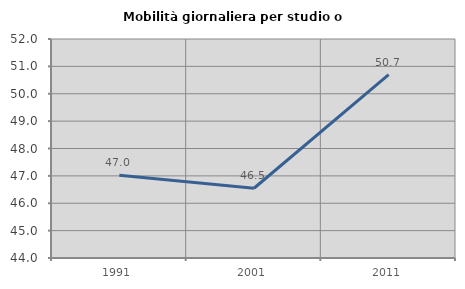
| Category | Mobilità giornaliera per studio o lavoro |
|---|---|
| 1991.0 | 47.027 |
| 2001.0 | 46.549 |
| 2011.0 | 50.702 |